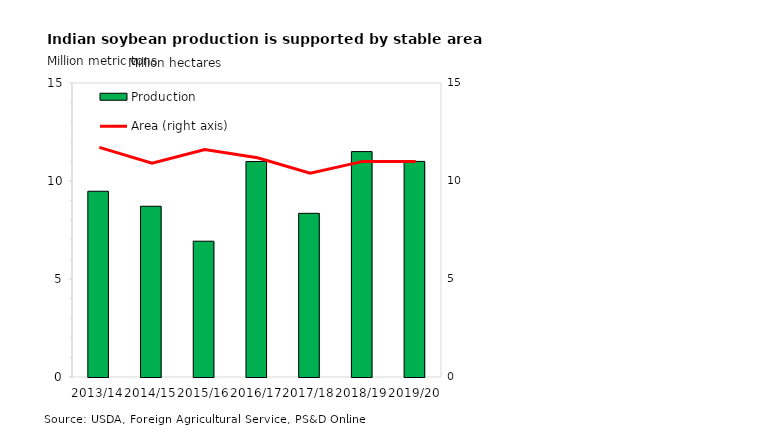
| Category | Production |
|---|---|
| 2013/14 | 9.477 |
| 2014/15 | 8.711 |
| 2015/16 | 6.929 |
| 2016/17 | 10.992 |
| 2017/18 | 8.35 |
| 2018/19 | 11.5 |
| 2019/20 | 11 |